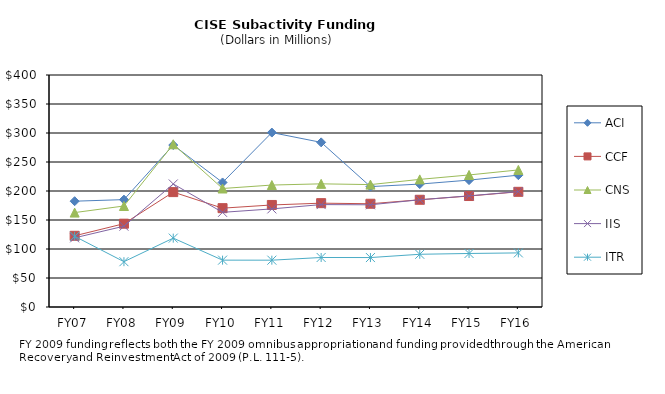
| Category | ACI | CCF | CNS | IIS | ITR |
|---|---|---|---|---|---|
| FY07 | 182.42 | 122.76 | 162.77 | 119.25 | 121.9 |
| FY08 | 185.15 | 143.63 | 174.16 | 139.33 | 78.14 |
| FY09 | 279.23 | 198.09 | 280.55 | 212.1 | 118.76 |
| FY10 | 214.72 | 170.398 | 204.325 | 163.213 | 80.78 |
| FY11 | 300.75 | 175.932 | 210.258 | 169.143 | 80.73 |
| FY12 | 283.84 | 179.03 | 212.36 | 176.58 | 85.35 |
| FY13 | 207.587 | 178.021 | 211.034 | 176.231 | 85.252 |
| FY14 | 211.93 | 184.88 | 220.02 | 184.87 | 90.91 |
| FY15 | 218.8 | 191.33 | 227.66 | 191.65 | 92.29 |
| FY16 | 227.29 | 198.59 | 236.32 | 198.94 | 93.27 |